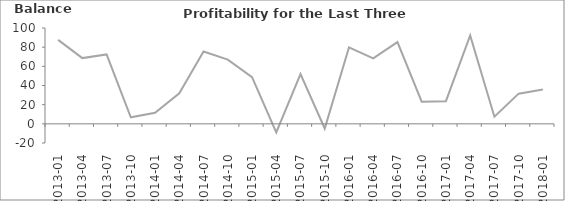
| Category | Balance |
|---|---|
| 2013-01 | 87.6 |
| 2013-04 | 68.6 |
| 2013-07 | 72.4 |
| 2013-10 | 6.8 |
| 2014-01 | 11.6 |
| 2014-04 | 31.9 |
| 2014-07 | 75.4 |
| 2014-10 | 67 |
| 2015-01 | 48.8 |
| 2015-04 | -8.9 |
| 2015-07 | 51.9 |
| 2015-10 | -4.9 |
| 2016-01 | 79.8 |
| 2016-04 | 68.3 |
| 2016-07 | 85.3 |
| 2016-10 | 23.1 |
| 2017-01 | 23.6 |
| 2017-04 | 92.3 |
| 2017-07 | 7.4 |
| 2017-10 | 31.5 |
| 2018-01 | 35.9 |